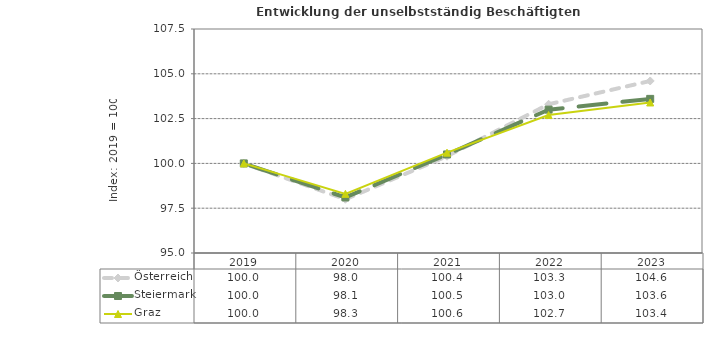
| Category | Österreich | Steiermark | Graz |
|---|---|---|---|
| 2023.0 | 104.6 | 103.6 | 103.4 |
| 2022.0 | 103.3 | 103 | 102.7 |
| 2021.0 | 100.4 | 100.5 | 100.6 |
| 2020.0 | 98 | 98.1 | 98.3 |
| 2019.0 | 100 | 100 | 100 |